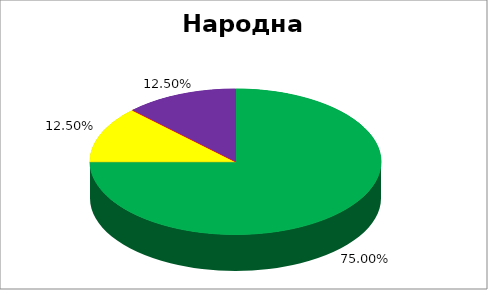
| Category | Народна скупштина |
|---|---|
| 0.75 | 0.75 |
| 0.0 | 0 |
| 0.125 | 0.125 |
| 0.0 | 0 |
| 0.125 | 0.125 |